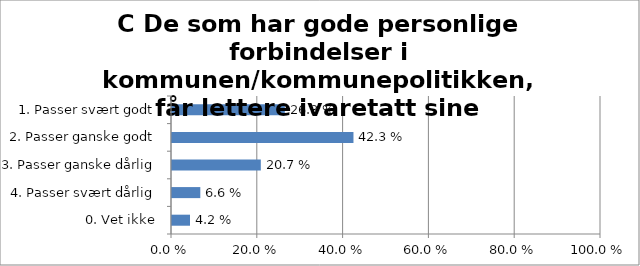
| Category | C De som har gode personlige forbindelser i kommunen/kommunepolitikken, får lettere ivaretatt sine interesser |
|---|---|
| 1. Passer svært godt | 0.263 |
| 2. Passer ganske godt | 0.423 |
| 3. Passer ganske dårlig | 0.207 |
| 4. Passer svært dårlig | 0.066 |
| 0. Vet ikke | 0.042 |